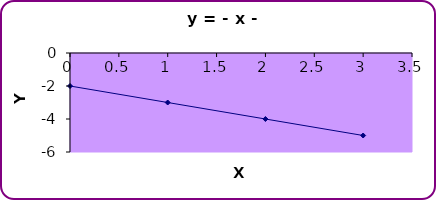
| Category | Series 0 |
|---|---|
| 0.0 | -2 |
| 1.0 | -3 |
| 2.0 | -4 |
| 3.0 | -5 |